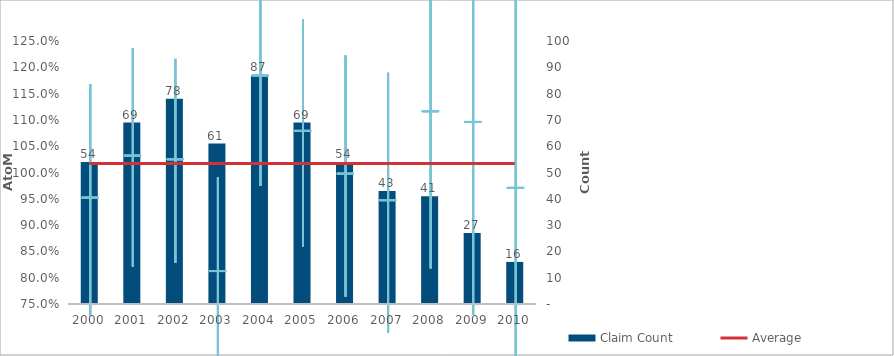
| Category | Claim Count |
|---|---|
| 0 | 54 |
| 1 | 69 |
| 2 | 78 |
| 3 | 61 |
| 4 | 87 |
| 5 | 69 |
| 6 | 54 |
| 7 | 43 |
| 8 | 41 |
| 9 | 27 |
| 10 | 16 |